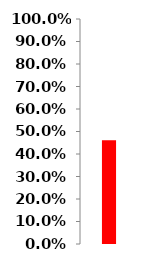
| Category | Series 0 |
|---|---|
| 0 | 0.461 |